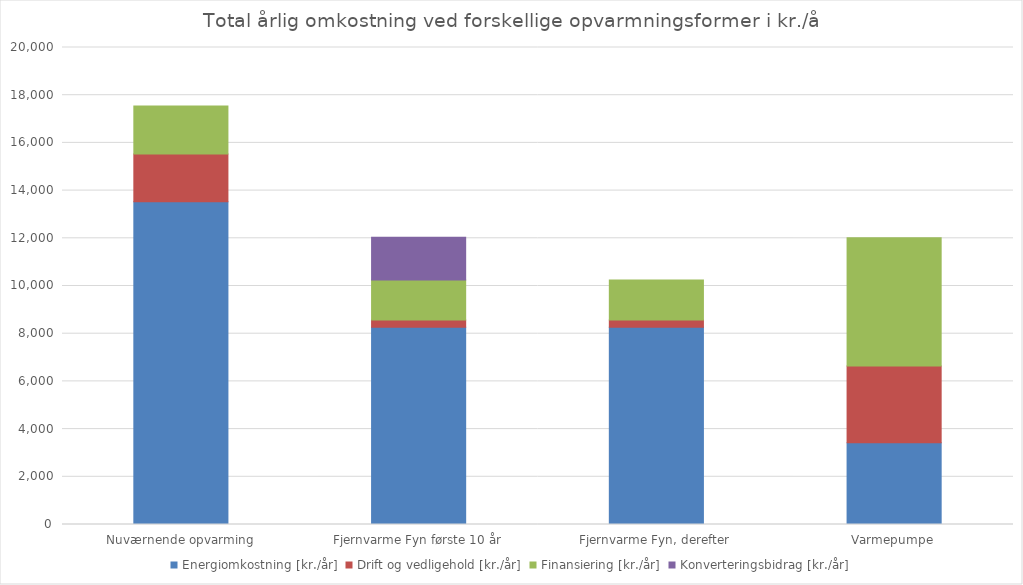
| Category | Energiomkostning | Drift og vedligehold | Finansiering | Konverteringsbidrag |
|---|---|---|---|---|
| Nuværnende opvarming | 13534.6 | 2000 | 2016.471 | 0 |
| Fjernvarme Fyn første 10 år | 8275.605 | 300 | 1680.393 | 1788 |
| Fjernvarme Fyn, derefter | 8275.605 | 300 | 1680.393 | 0 |
| Varmepumpe | 3425.571 | 3225 | 5377.257 | 0 |